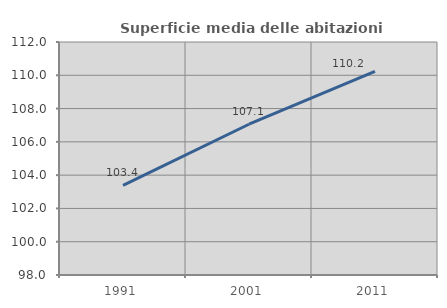
| Category | Superficie media delle abitazioni occupate |
|---|---|
| 1991.0 | 103.387 |
| 2001.0 | 107.059 |
| 2011.0 | 110.23 |